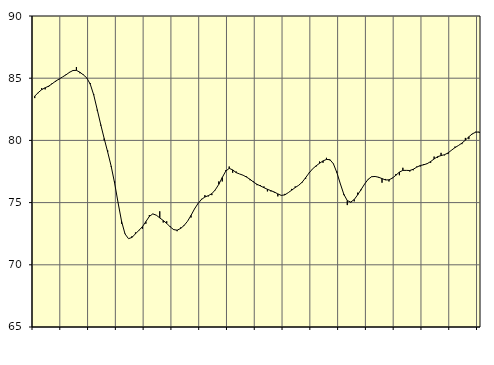
| Category | Piggar | Series 1 |
|---|---|---|
| nan | 83.4 | 83.56 |
| 87.0 | 83.8 | 83.84 |
| 87.0 | 84.2 | 84.08 |
| 87.0 | 84.1 | 84.23 |
| nan | 84.3 | 84.36 |
| 88.0 | 84.6 | 84.55 |
| 88.0 | 84.7 | 84.76 |
| 88.0 | 84.9 | 84.93 |
| nan | 85.1 | 85.1 |
| 89.0 | 85.3 | 85.27 |
| 89.0 | 85.5 | 85.47 |
| 89.0 | 85.6 | 85.62 |
| nan | 85.9 | 85.63 |
| 90.0 | 85.4 | 85.48 |
| 90.0 | 85.3 | 85.27 |
| 90.0 | 85 | 85.02 |
| nan | 84.6 | 84.51 |
| 91.0 | 83.7 | 83.64 |
| 91.0 | 82.4 | 82.47 |
| 91.0 | 81.2 | 81.27 |
| nan | 80 | 80.15 |
| 92.0 | 79.2 | 79.07 |
| 92.0 | 77.9 | 77.94 |
| 92.0 | 76.7 | 76.57 |
| nan | 75 | 74.99 |
| 93.0 | 73.3 | 73.5 |
| 93.0 | 72.5 | 72.48 |
| 93.0 | 72.1 | 72.1 |
| nan | 72.3 | 72.2 |
| 94.0 | 72.6 | 72.49 |
| 94.0 | 72.8 | 72.77 |
| 94.0 | 72.9 | 73.06 |
| nan | 73.3 | 73.47 |
| 95.0 | 74 | 73.89 |
| 95.0 | 74.1 | 74.09 |
| 95.0 | 74 | 73.99 |
| nan | 74.3 | 73.77 |
| 96.0 | 73.4 | 73.56 |
| 96.0 | 73.5 | 73.33 |
| 96.0 | 73.1 | 73.05 |
| nan | 72.8 | 72.83 |
| 97.0 | 72.7 | 72.78 |
| 97.0 | 73 | 72.92 |
| 97.0 | 73.2 | 73.16 |
| nan | 73.5 | 73.5 |
| 98.0 | 73.8 | 73.97 |
| 98.0 | 74.5 | 74.49 |
| 98.0 | 74.9 | 74.92 |
| nan | 75.3 | 75.25 |
| 99.0 | 75.6 | 75.45 |
| 99.0 | 75.5 | 75.56 |
| 99.0 | 75.6 | 75.72 |
| nan | 76 | 76.03 |
| 0.0 | 76.7 | 76.47 |
| 0.0 | 76.7 | 77.02 |
| 0.0 | 77.6 | 77.53 |
| nan | 77.9 | 77.75 |
| 1.0 | 77.4 | 77.63 |
| 1.0 | 77.5 | 77.41 |
| 1.0 | 77.3 | 77.3 |
| nan | 77.2 | 77.2 |
| 2.0 | 77.1 | 77.05 |
| 2.0 | 76.8 | 76.87 |
| 2.0 | 76.7 | 76.65 |
| nan | 76.4 | 76.47 |
| 3.0 | 76.4 | 76.34 |
| 3.0 | 76.3 | 76.2 |
| 3.0 | 75.9 | 76.07 |
| nan | 75.9 | 75.96 |
| 4.0 | 75.8 | 75.85 |
| 4.0 | 75.5 | 75.7 |
| 4.0 | 75.6 | 75.58 |
| nan | 75.7 | 75.62 |
| 5.0 | 75.8 | 75.8 |
| 5.0 | 76.1 | 76 |
| 5.0 | 76.3 | 76.21 |
| nan | 76.4 | 76.39 |
| 6.0 | 76.6 | 76.64 |
| 6.0 | 76.9 | 77 |
| 6.0 | 77.4 | 77.38 |
| nan | 77.7 | 77.71 |
| 7.0 | 77.9 | 77.95 |
| 7.0 | 78.3 | 78.16 |
| 7.0 | 78.2 | 78.35 |
| nan | 78.6 | 78.47 |
| 8.0 | 78.4 | 78.45 |
| 8.0 | 78.1 | 78.12 |
| 8.0 | 77.5 | 77.41 |
| nan | 76.5 | 76.51 |
| 9.0 | 75.6 | 75.67 |
| 9.0 | 74.8 | 75.16 |
| 9.0 | 75 | 75.04 |
| nan | 75.1 | 75.25 |
| 10.0 | 75.8 | 75.63 |
| 10.0 | 76 | 76.06 |
| 10.0 | 76.5 | 76.5 |
| nan | 76.9 | 76.87 |
| 11.0 | 77.1 | 77.08 |
| 11.0 | 77.1 | 77.1 |
| 11.0 | 77 | 77.04 |
| nan | 76.6 | 76.93 |
| 12.0 | 76.9 | 76.82 |
| 12.0 | 76.7 | 76.83 |
| 12.0 | 77 | 76.97 |
| nan | 77.3 | 77.2 |
| 13.0 | 77.2 | 77.45 |
| 13.0 | 77.8 | 77.59 |
| 13.0 | 77.6 | 77.59 |
| nan | 77.5 | 77.58 |
| 14.0 | 77.6 | 77.68 |
| 14.0 | 77.9 | 77.85 |
| 14.0 | 77.9 | 77.98 |
| nan | 78.1 | 78.04 |
| 15.0 | 78.1 | 78.13 |
| 15.0 | 78.2 | 78.3 |
| 15.0 | 78.7 | 78.51 |
| nan | 78.6 | 78.69 |
| 16.0 | 79 | 78.78 |
| 16.0 | 78.8 | 78.85 |
| 16.0 | 78.9 | 78.99 |
| nan | 79.2 | 79.21 |
| 17.0 | 79.5 | 79.42 |
| 17.0 | 79.6 | 79.59 |
| 17.0 | 79.7 | 79.78 |
| nan | 80.2 | 80.02 |
| 18.0 | 80.1 | 80.29 |
| 18.0 | 80.5 | 80.53 |
| 18.0 | 80.7 | 80.66 |
| nan | 80.6 | 80.68 |